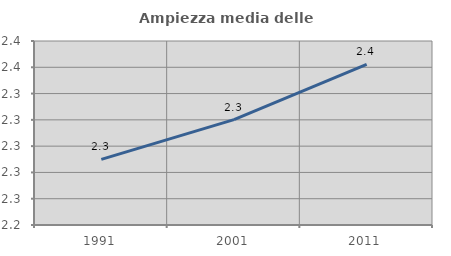
| Category | Ampiezza media delle famiglie |
|---|---|
| 1991.0 | 2.29 |
| 2001.0 | 2.32 |
| 2011.0 | 2.362 |